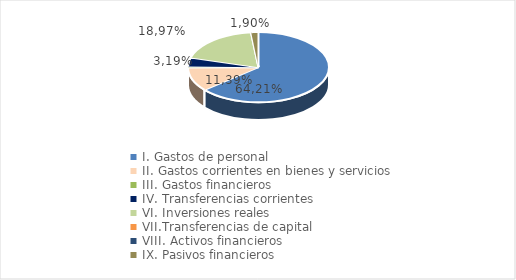
| Category | Series 0 |
|---|---|
| I. Gastos de personal | 206615194.5 |
| II. Gastos corrientes en bienes y servicios | 35666472.07 |
| III. Gastos financieros | 1195465.72 |
| IV. Transferencias corrientes | 13479745.9 |
| VI. Inversiones reales | 61037567.13 |
| VII.Transferencias de capital | 186778.57 |
| VIII. Activos financieros | 41400 |
| IX. Pasivos financieros | 5373262.43 |